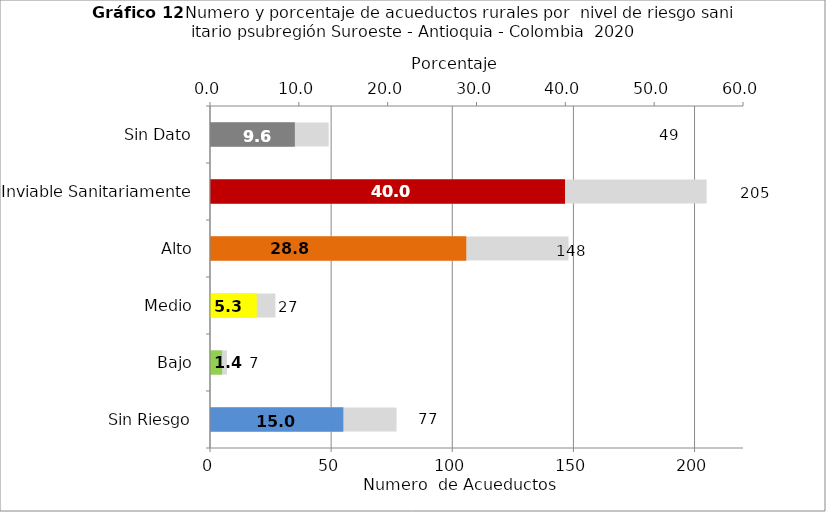
| Category | Número de Sistemas |
|---|---|
| Sin Riesgo | 77 |
| Bajo | 7 |
| Medio | 27 |
| Alto | 148 |
| Inviable Sanitariamente | 205 |
| Sin Dato | 49 |